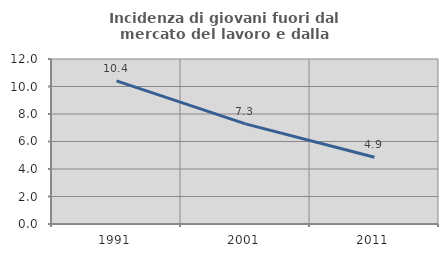
| Category | Incidenza di giovani fuori dal mercato del lavoro e dalla formazione  |
|---|---|
| 1991.0 | 10.407 |
| 2001.0 | 7.284 |
| 2011.0 | 4.859 |